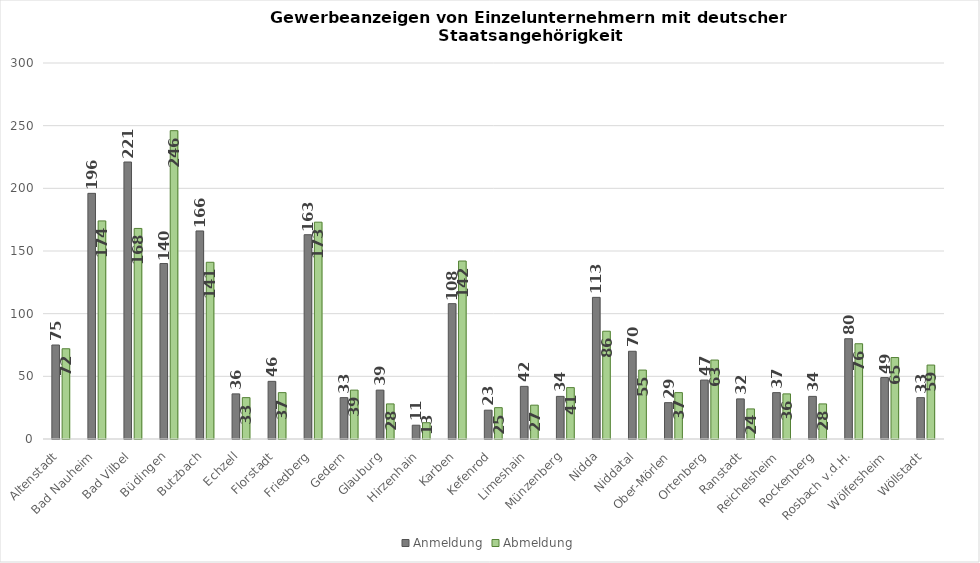
| Category | Anmeldung | Abmeldung |
|---|---|---|
| Altenstadt | 75 | 72 |
| Bad Nauheim | 196 | 174 |
| Bad Vilbel | 221 | 168 |
| Büdingen | 140 | 246 |
| Butzbach | 166 | 141 |
| Echzell | 36 | 33 |
| Florstadt | 46 | 37 |
| Friedberg | 163 | 173 |
| Gedern | 33 | 39 |
| Glauburg | 39 | 28 |
| Hirzenhain | 11 | 13 |
| Karben | 108 | 142 |
| Kefenrod | 23 | 25 |
| Limeshain | 42 | 27 |
| Münzenberg | 34 | 41 |
| Nidda | 113 | 86 |
| Niddatal | 70 | 55 |
| Ober-Mörlen | 29 | 37 |
| Ortenberg | 47 | 63 |
| Ranstadt | 32 | 24 |
| Reichelsheim | 37 | 36 |
| Rockenberg | 34 | 28 |
| Rosbach v.d.H. | 80 | 76 |
| Wölfersheim | 49 | 65 |
| Wöllstadt | 33 | 59 |